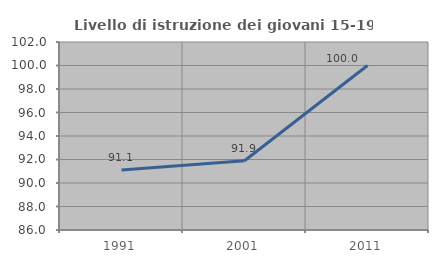
| Category | Livello di istruzione dei giovani 15-19 anni |
|---|---|
| 1991.0 | 91.111 |
| 2001.0 | 91.892 |
| 2011.0 | 100 |